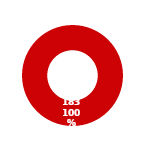
| Category | Series 10 |
|---|---|
| Count Complete | 0 |
| Count Not Complete | 183 |